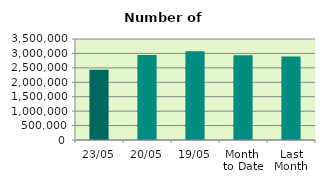
| Category | Series 0 |
|---|---|
| 23/05 | 2436926 |
| 20/05 | 2942494 |
| 19/05 | 3075936 |
| Month 
to Date | 2941140 |
| Last
Month | 2895009.158 |